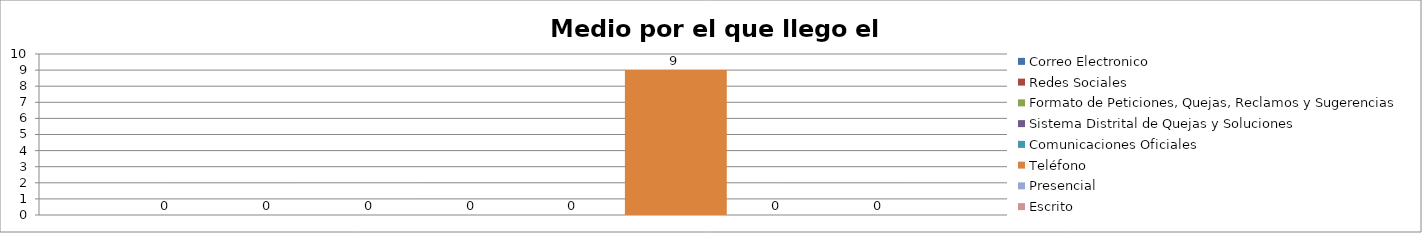
| Category | Correo Electronico | Redes Sociales | Formato de Peticiones, Quejas, Reclamos y Sugerencias | Sistema Distrital de Quejas y Soluciones  | Comunicaciones Oficiales | Teléfono | Presencial | Escrito  |
|---|---|---|---|---|---|---|---|---|
| 0 | 0 | 0 | 0 | 0 | 0 | 9 | 0 | 0 |